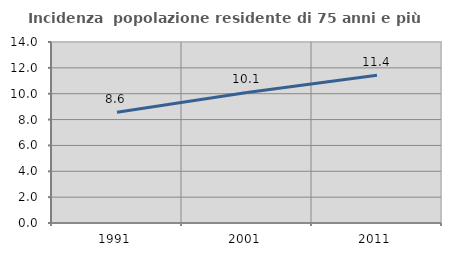
| Category | Incidenza  popolazione residente di 75 anni e più |
|---|---|
| 1991.0 | 8.573 |
| 2001.0 | 10.1 |
| 2011.0 | 11.43 |